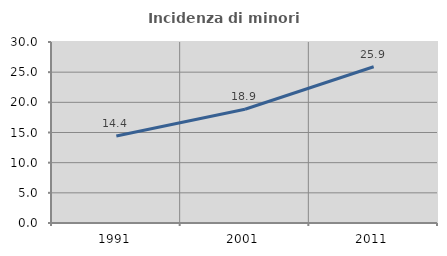
| Category | Incidenza di minori stranieri |
|---|---|
| 1991.0 | 14.423 |
| 2001.0 | 18.858 |
| 2011.0 | 25.904 |